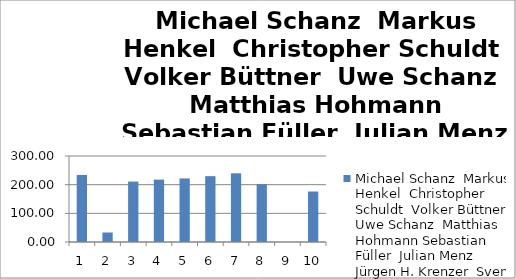
| Category | Michael Schanz  Markus Henkel  Christopher Schuldt  Volker Büttner  Uwe Schanz  Matthias Hohmann Sebastian Füller  Julian Menz  Jürgen H. Krenzer  Sven Dombrowski |
|---|---|
| 0 | 233.85 |
| 1 | 33.15 |
| 2 | 210.83 |
| 3 | 217.59 |
| 4 | 221.75 |
| 5 | 229.65 |
| 6 | 239.56 |
| 7 | 201.9 |
| 8 | 0 |
| 9 | 176.07 |